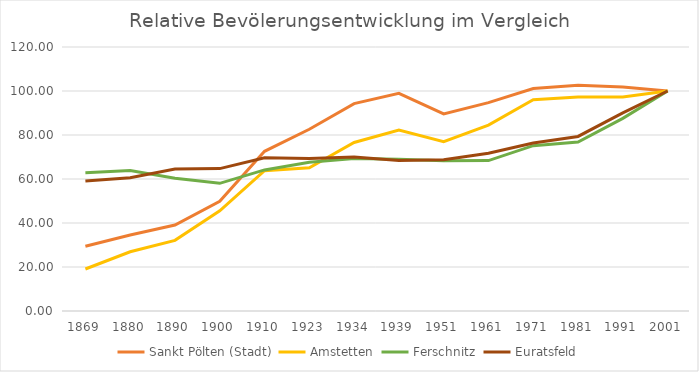
| Category | Sankt Pölten (Stadt) | Amstetten | Ferschnitz | Euratsfeld |
|---|---|---|---|---|
| 1869 | 29.458 | 19.088 | 62.827 | 59.12 |
| 1880 | 34.533 | 26.935 | 63.823 | 60.586 |
| 1890 | 39.055 | 32.104 | 60.336 | 64.511 |
| 1900 | 49.891 | 45.528 | 58.032 | 64.726 |
| 1910 | 72.572 | 63.797 | 64.134 | 69.685 |
| 1923 | 82.6 | 65.125 | 67.621 | 69.34 |
| 1934 | 94.265 | 76.614 | 69.365 | 70.03 |
| 1939 | 98.905 | 82.204 | 68.929 | 68.435 |
| 1951 | 89.585 | 76.92 | 68.244 | 68.78 |
| 1961 | 94.705 | 84.47 | 68.369 | 71.712 |
| 1971 | 101.105 | 96.017 | 75.156 | 76.369 |
| 1981 | 102.642 | 97.318 | 76.837 | 79.345 |
| 1991 | 101.842 | 97.243 | 87.547 | 90.039 |
| 2001 | 100 | 100 | 100 | 100 |